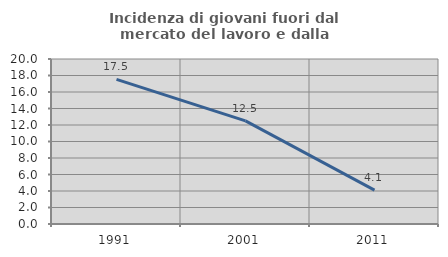
| Category | Incidenza di giovani fuori dal mercato del lavoro e dalla formazione  |
|---|---|
| 1991.0 | 17.526 |
| 2001.0 | 12.5 |
| 2011.0 | 4.11 |